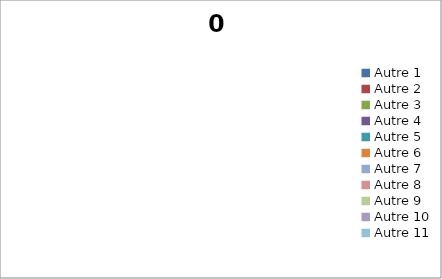
| Category | 0 |
|---|---|
| Autre 1 | 0 |
| Autre 2 | 0 |
| Autre 3 | 0 |
| Autre 4 | 0 |
| Autre 5 | 0 |
| Autre 6 | 0 |
| Autre 7 | 0 |
| Autre 8 | 0 |
| Autre 9 | 0 |
| Autre 10 | 0 |
| Autre 11 | 0 |